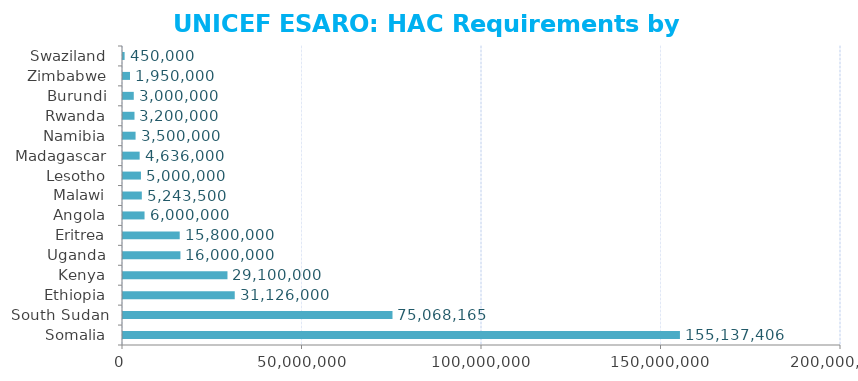
| Category | Requirements |
|---|---|
| Somalia | 155137406 |
| South Sudan | 75068165 |
| Ethiopia | 31126000 |
| Kenya | 29100000 |
| Uganda | 16000000 |
| Eritrea | 15800000 |
| Angola | 6000000 |
| Malawi | 5243500 |
| Lesotho | 5000000 |
| Madagascar | 4636000 |
| Namibia | 3500000 |
| Rwanda | 3200000 |
| Burundi | 3000000 |
| Zimbabwe | 1950000 |
| Swaziland | 450000 |